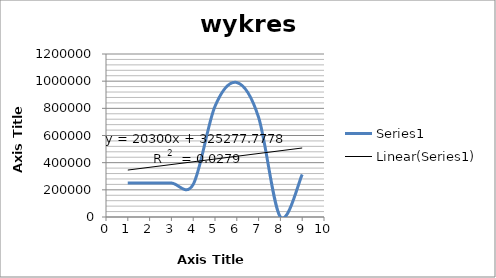
| Category | Series 0 |
|---|---|
| 0 | 250000 |
| 1 | 250000 |
| 2 | 250000 |
| 3 | 240000 |
| 4 | 815000 |
| 5 | 990000 |
| 6 | 733000 |
| 7 | 0 |
| 8 | 313000 |